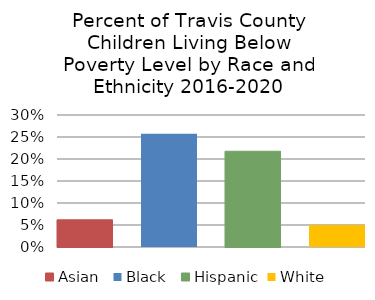
| Category | Asian  | Black  | Hispanic | White |
|---|---|---|---|---|
| 2020.0 | 0.062 | 0.257 | 0.218 | 0.05 |